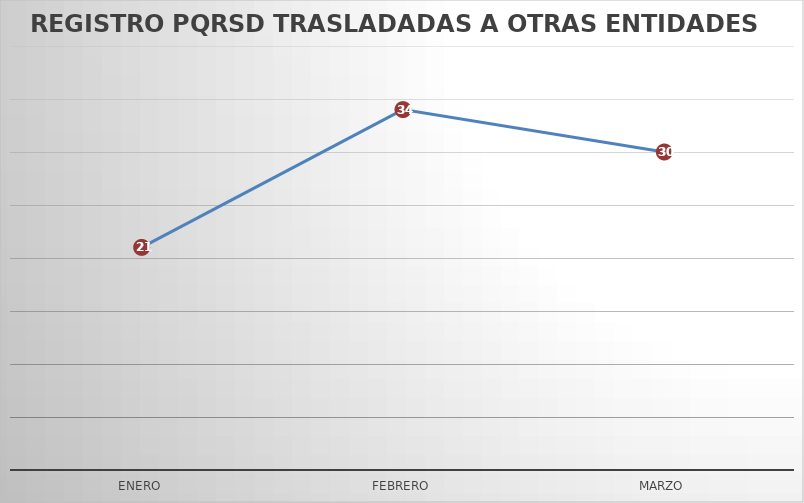
| Category | Series 0 |
|---|---|
| ENERO | 21 |
| FEBRERO | 34 |
| MARZO | 30 |